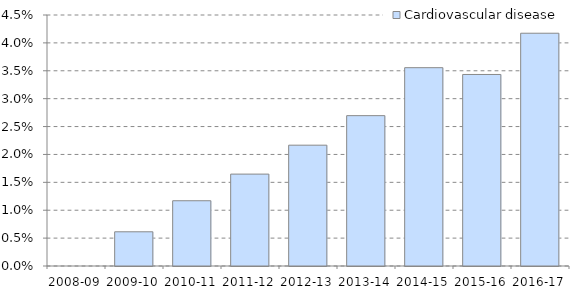
| Category | Cardiovascular disease |
|---|---|
| 2008-09 | 0 |
| 2009-10 | 0.006 |
| 2010-11 | 0.012 |
| 2011-12 | 0.016 |
| 2012-13 | 0.022 |
| 2013-14 | 0.027 |
| 2014-15 | 0.036 |
| 2015-16 | 0.034 |
| 2016-17 | 0.042 |